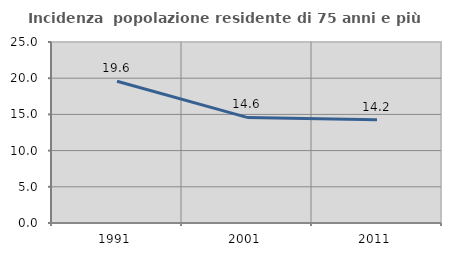
| Category | Incidenza  popolazione residente di 75 anni e più |
|---|---|
| 1991.0 | 19.585 |
| 2001.0 | 14.589 |
| 2011.0 | 14.247 |